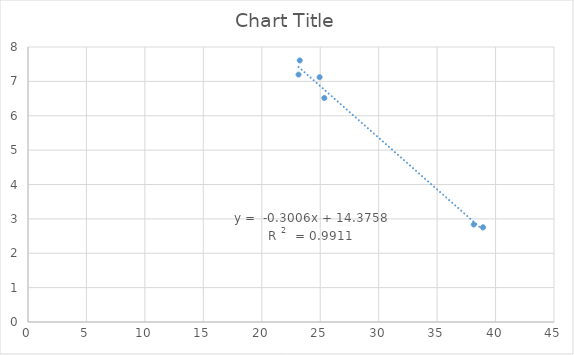
| Category | Series 0 |
|---|---|
| 23.146666666666665 | 7.197 |
| 23.24666666666667 | 7.608 |
| 24.9466666666667 | 7.121 |
| 25.349999999999998 | 6.516 |
| 38.92666666666667 | 2.756 |
| 38.13333333333333 | 2.835 |